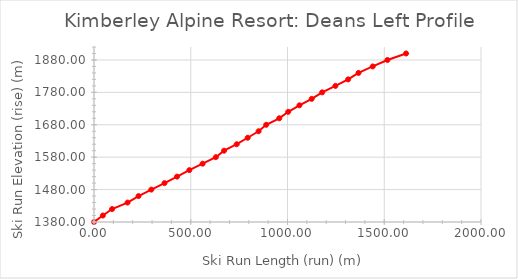
| Category | Series 0 |
|---|---|
| 0.0 | 1380 |
| 45.74 | 1400 |
| 93.46000000000001 | 1420 |
| 173.43 | 1440 |
| 230.09 | 1460 |
| 296.2 | 1480 |
| 364.43 | 1500 |
| 429.28 | 1520 |
| 492.59 | 1540 |
| 561.14 | 1560 |
| 629.68 | 1580 |
| 672.17 | 1600 |
| 737.7199999999999 | 1620 |
| 794.3499999999999 | 1640 |
| 850.56 | 1660 |
| 889.93 | 1680 |
| 957.3599999999999 | 1700 |
| 1003.6499999999999 | 1720 |
| 1061.6799999999998 | 1740 |
| 1125.09 | 1760 |
| 1179.08 | 1780 |
| 1247.61 | 1800 |
| 1313.33 | 1820 |
| 1366.97 | 1840 |
| 1440.48 | 1860 |
| 1516.59 | 1880 |
| 1612.83 | 1900 |